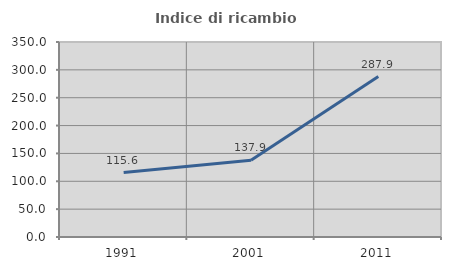
| Category | Indice di ricambio occupazionale  |
|---|---|
| 1991.0 | 115.625 |
| 2001.0 | 137.931 |
| 2011.0 | 287.879 |